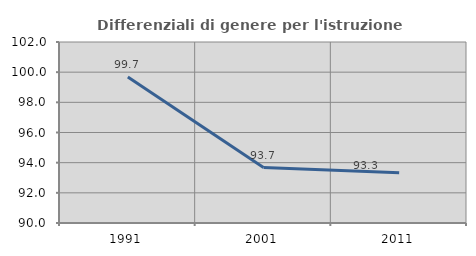
| Category | Differenziali di genere per l'istruzione superiore |
|---|---|
| 1991.0 | 99.675 |
| 2001.0 | 93.675 |
| 2011.0 | 93.329 |